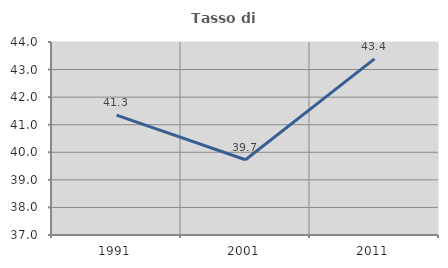
| Category | Tasso di occupazione   |
|---|---|
| 1991.0 | 41.346 |
| 2001.0 | 39.73 |
| 2011.0 | 43.39 |